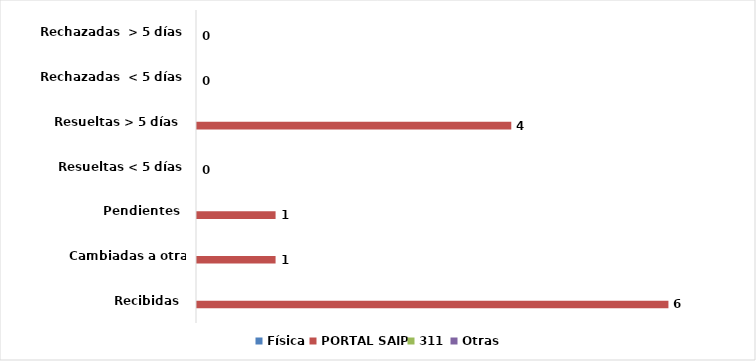
| Category | Física | PORTAL SAIP | 311 | Otras |
|---|---|---|---|---|
| Recibidas  | 0 | 6 | 0 | 0 |
| Cambiadas a otra institución | 0 | 1 | 0 | 0 |
| Pendientes  | 0 | 1 | 0 | 0 |
| Resueltas < 5 días | 0 | 0 | 0 | 0 |
| Resueltas > 5 días  | 0 | 4 | 0 | 0 |
| Rechazadas  < 5 días | 0 | 0 | 0 | 0 |
| Rechazadas  > 5 días | 0 | 0 | 0 | 0 |